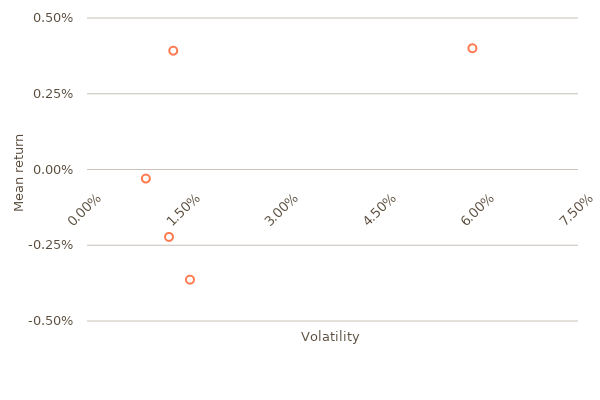
| Category | AAPL qqq SPY C GME |
|---|---|
| 0.015727 | -0.004 |
| 0.012524 | -0.002 |
| 0.00899 | 0 |
| 0.013177 | 0.004 |
| 0.058871 | 0.004 |